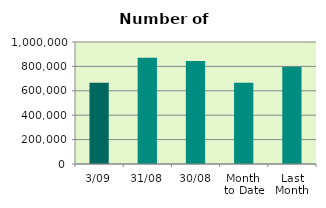
| Category | Series 0 |
|---|---|
| 3/09 | 665492 |
| 31/08 | 871588 |
| 30/08 | 843374 |
| Month 
to Date | 665492 |
| Last
Month | 797310 |